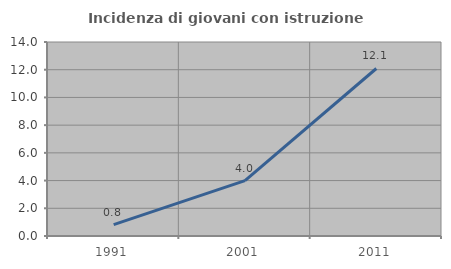
| Category | Incidenza di giovani con istruzione universitaria |
|---|---|
| 1991.0 | 0.82 |
| 2001.0 | 4 |
| 2011.0 | 12.088 |